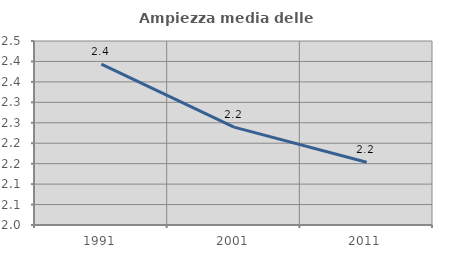
| Category | Ampiezza media delle famiglie |
|---|---|
| 1991.0 | 2.393 |
| 2001.0 | 2.239 |
| 2011.0 | 2.154 |